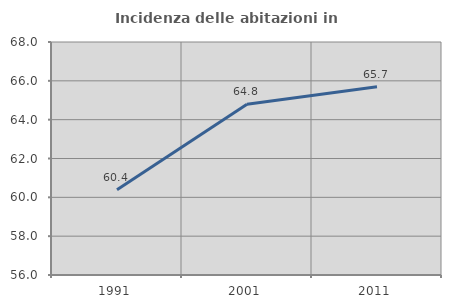
| Category | Incidenza delle abitazioni in proprietà  |
|---|---|
| 1991.0 | 60.395 |
| 2001.0 | 64.797 |
| 2011.0 | 65.698 |